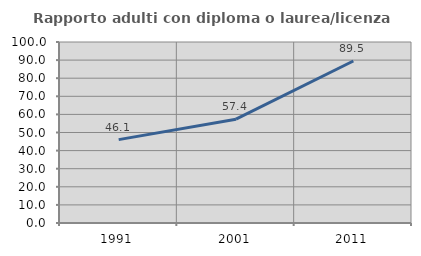
| Category | Rapporto adulti con diploma o laurea/licenza media  |
|---|---|
| 1991.0 | 46.056 |
| 2001.0 | 57.352 |
| 2011.0 | 89.494 |